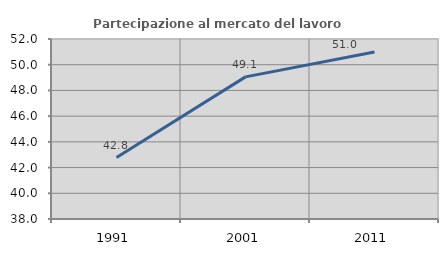
| Category | Partecipazione al mercato del lavoro  femminile |
|---|---|
| 1991.0 | 42.776 |
| 2001.0 | 49.054 |
| 2011.0 | 50.989 |